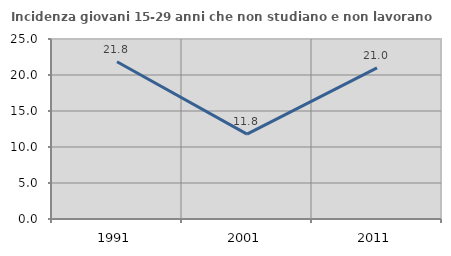
| Category | Incidenza giovani 15-29 anni che non studiano e non lavorano  |
|---|---|
| 1991.0 | 21.834 |
| 2001.0 | 11.792 |
| 2011.0 | 20.994 |